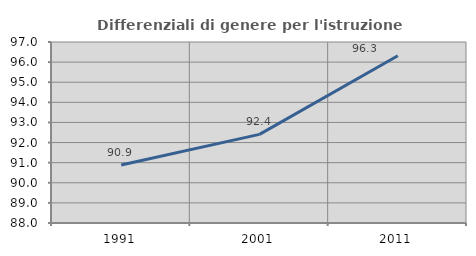
| Category | Differenziali di genere per l'istruzione superiore |
|---|---|
| 1991.0 | 90.884 |
| 2001.0 | 92.406 |
| 2011.0 | 96.315 |